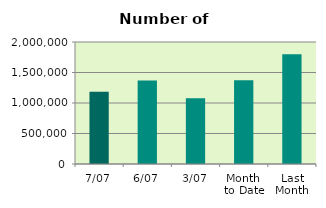
| Category | Series 0 |
|---|---|
| 7/07 | 1186102 |
| 6/07 | 1368114 |
| 3/07 | 1079514 |
| Month 
to Date | 1371952 |
| Last
Month | 1799892.818 |